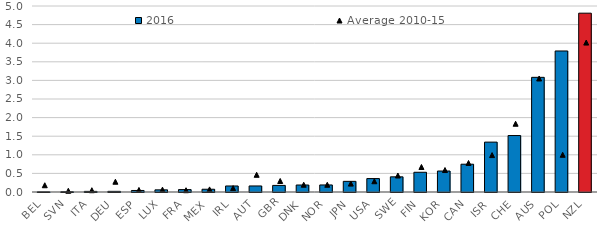
| Category | 2016 |
|---|---|
| BEL | 0.003 |
| SVN | 0.006 |
| ITA | 0.016 |
| DEU | 0.017 |
| ESP | 0.041 |
| LUX | 0.058 |
| FRA | 0.065 |
| MEX | 0.074 |
| IRL | 0.162 |
| AUT | 0.162 |
| GBR | 0.177 |
| DNK | 0.188 |
| NOR | 0.189 |
| JPN | 0.286 |
| USA | 0.361 |
| SWE | 0.408 |
| FIN | 0.53 |
| KOR | 0.564 |
| CAN | 0.747 |
| ISR | 1.341 |
| CHE | 1.518 |
| AUS | 3.082 |
| POL | 3.791 |
| NZL | 4.807 |